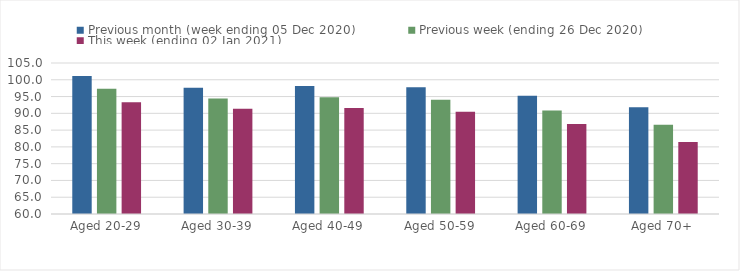
| Category | Previous month (week ending 05 Dec 2020) | Previous week (ending 26 Dec 2020) | This week (ending 02 Jan 2021) |
|---|---|---|---|
| Aged 20-29 | 101.1 | 97.36 | 93.31 |
| Aged 30-39 | 97.66 | 94.43 | 91.34 |
| Aged 40-49 | 98.18 | 94.78 | 91.59 |
| Aged 50-59 | 97.79 | 94.04 | 90.5 |
| Aged 60-69 | 95.23 | 90.82 | 86.81 |
| Aged 70+ | 91.81 | 86.62 | 81.43 |